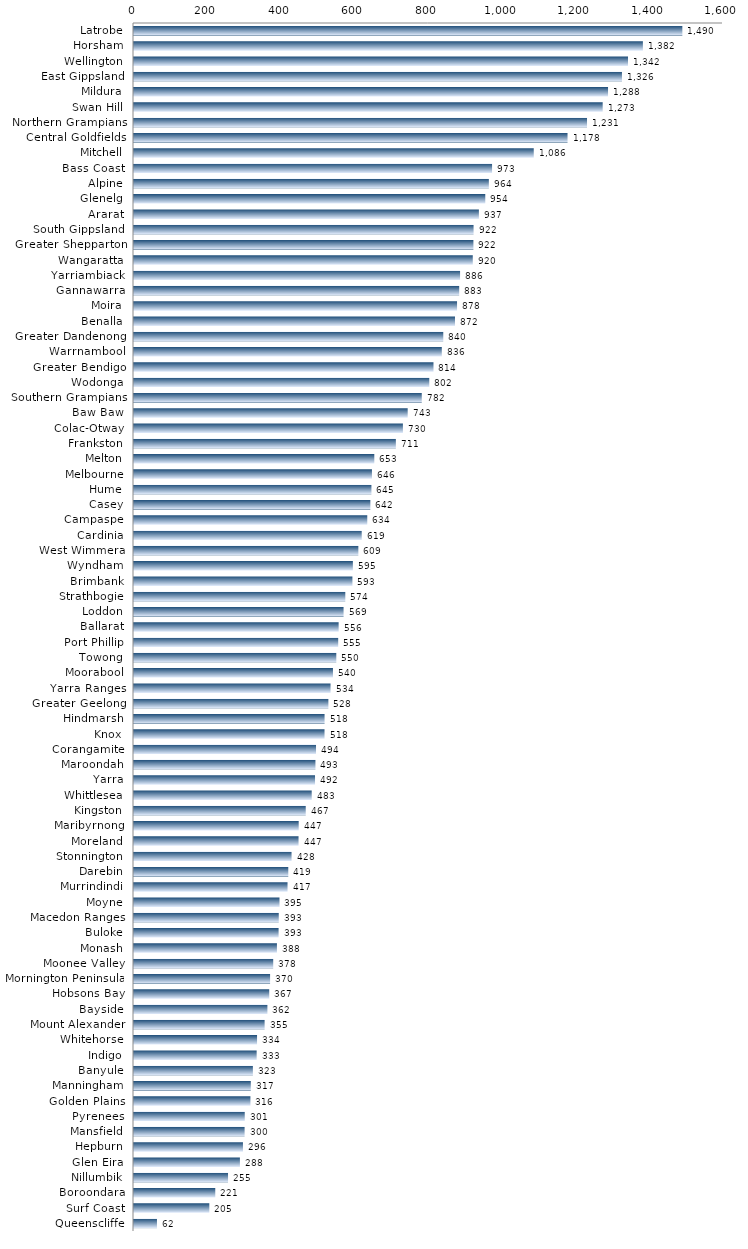
| Category | Series 0 |
|---|---|
| Latrobe | 1489.576 |
| Horsham | 1382.398 |
| Wellington | 1341.959 |
| East Gippsland | 1325.506 |
| Mildura | 1287.704 |
| Swan Hill | 1273.165 |
| Northern Grampians | 1230.614 |
| Central Goldfields | 1177.691 |
| Mitchell | 1085.924 |
| Bass Coast | 972.665 |
| Alpine | 963.947 |
| Glenelg | 954.237 |
| Ararat | 936.888 |
| South Gippsland | 922.425 |
| Greater Shepparton | 921.987 |
| Wangaratta | 920.286 |
| Yarriambiack | 885.781 |
| Gannawarra | 883.359 |
| Moira | 877.538 |
| Benalla | 871.972 |
| Greater Dandenong | 840.141 |
| Warrnambool | 836.149 |
| Greater Bendigo | 813.539 |
| Wodonga | 802.108 |
| Southern Grampians | 781.727 |
| Baw Baw | 743.469 |
| Colac-Otway | 730.487 |
| Frankston | 711.337 |
| Melton | 652.788 |
| Melbourne | 646.38 |
| Hume | 644.975 |
| Casey | 642.055 |
| Campaspe | 633.667 |
| Cardinia | 618.599 |
| West Wimmera | 609.446 |
| Wyndham | 594.577 |
| Brimbank | 593.334 |
| Strathbogie | 574.013 |
| Loddon | 569.285 |
| Ballarat | 555.906 |
| Port Phillip | 554.721 |
| Towong | 549.539 |
| Moorabool | 540.484 |
| Yarra Ranges | 533.879 |
| Greater Geelong | 528.039 |
| Hindmarsh | 517.672 |
| Knox | 517.553 |
| Corangamite | 494.461 |
| Maroondah | 492.888 |
| Yarra | 491.761 |
| Whittlesea | 482.759 |
| Kingston | 466.518 |
| Maribyrnong | 447.404 |
| Moreland | 446.986 |
| Stonnington | 427.994 |
| Darebin | 419.092 |
| Murrindindi | 417.074 |
| Moyne | 395.234 |
| Macedon Ranges | 393.233 |
| Buloke | 392.799 |
| Monash | 388.276 |
| Moonee Valley | 378.169 |
| Mornington Peninsula | 369.693 |
| Hobsons Bay | 367.359 |
| Bayside | 362.386 |
| Mount Alexander | 354.82 |
| Whitehorse | 334.27 |
| Indigo | 333.199 |
| Banyule | 322.941 |
| Manningham | 317.315 |
| Golden Plains | 316.256 |
| Pyrenees | 300.85 |
| Mansfield | 300.446 |
| Hepburn | 295.983 |
| Glen Eira | 287.698 |
| Nillumbik | 255.434 |
| Boroondara | 220.765 |
| Surf Coast | 204.61 |
| Queenscliffe | 62.383 |